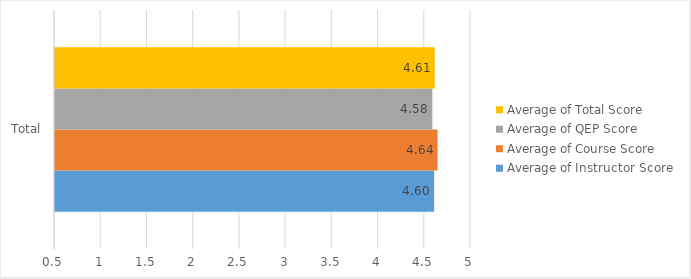
| Category | Average of Instructor Score | Average of Course Score | Average of QEP Score | Average of Total Score |
|---|---|---|---|---|
| Total | 4.601 | 4.638 | 4.582 | 4.608 |